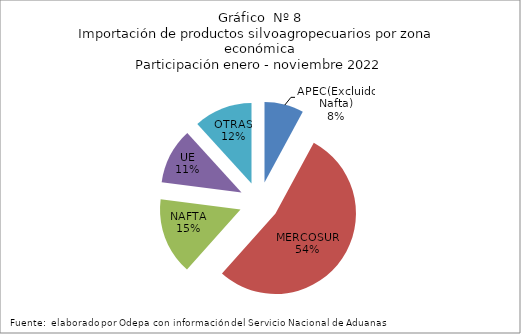
| Category | Series 0 |
|---|---|
| APEC(Excluido Nafta) | 704634.53 |
| MERCOSUR | 4795810.478 |
| NAFTA | 1379794.8 |
| UE | 1002227.246 |
| OTRAS | 1050114.946 |